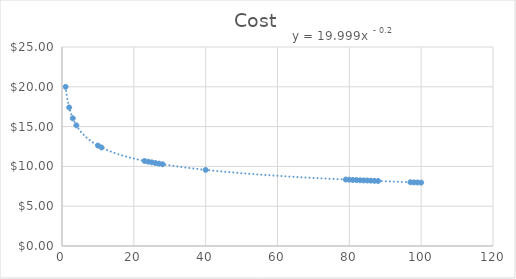
| Category | Cost |
|---|---|
| 1.0 | 20 |
| 2.0 | 17.41 |
| 3.0 | 16.05 |
| 4.0 | 15.16 |
| 10.0 | 12.62 |
| 11.0 | 12.38 |
| 23.0 | 10.68 |
| 24.0 | 10.59 |
| 25.0 | 10.51 |
| 26.0 | 10.42 |
| 27.0 | 10.35 |
| 28.0 | 10.27 |
| 40.0 | 9.56 |
| 79.0 | 8.35 |
| 80.0 | 8.33 |
| 81.0 | 8.3 |
| 82.0 | 8.28 |
| 83.0 | 8.26 |
| 84.0 | 8.24 |
| 85.0 | 8.23 |
| 86.0 | 8.21 |
| 87.0 | 8.19 |
| 88.0 | 8.17 |
| 97.0 | 8.01 |
| 98.0 | 7.99 |
| 99.0 | 7.98 |
| 100.0 | 7.96 |